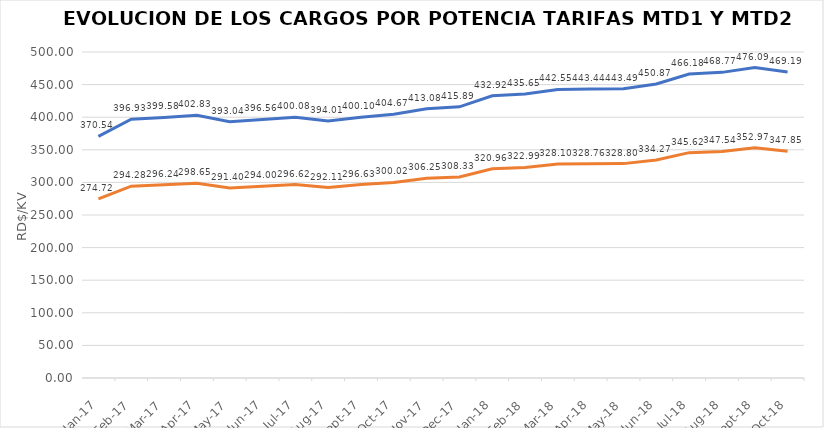
| Category | Series 0 | Series 1 |
|---|---|---|
| 2017-01-01 | 370.544 | 274.717 |
| 2017-02-01 | 396.93 | 294.28 |
| 2017-03-01 | 399.579 | 296.243 |
| 2017-04-01 | 402.83 | 298.65 |
| 2017-05-01 | 393.04 | 291.4 |
| 2017-06-01 | 396.555 | 294.002 |
| 2017-07-01 | 400.08 | 296.62 |
| 2017-08-01 | 394.007 | 292.112 |
| 2017-09-01 | 400.096 | 296.627 |
| 2017-10-01 | 404.673 | 300.02 |
| 2017-11-01 | 413.079 | 306.252 |
| 2017-12-01 | 415.887 | 308.334 |
| 2018-01-01 | 432.921 | 320.963 |
| 2018-02-01 | 435.65 | 322.99 |
| 2018-03-01 | 442.548 | 328.1 |
| 2018-04-01 | 443.441 | 328.763 |
| 2018-05-01 | 443.49 | 328.8 |
| 2018-06-01 | 450.875 | 334.273 |
| 2018-07-01 | 466.183 | 345.623 |
| 2018-08-01 | 468.773 | 347.543 |
| 2018-09-01 | 476.093 | 352.97 |
| 2018-10-01 | 469.192 | 347.854 |